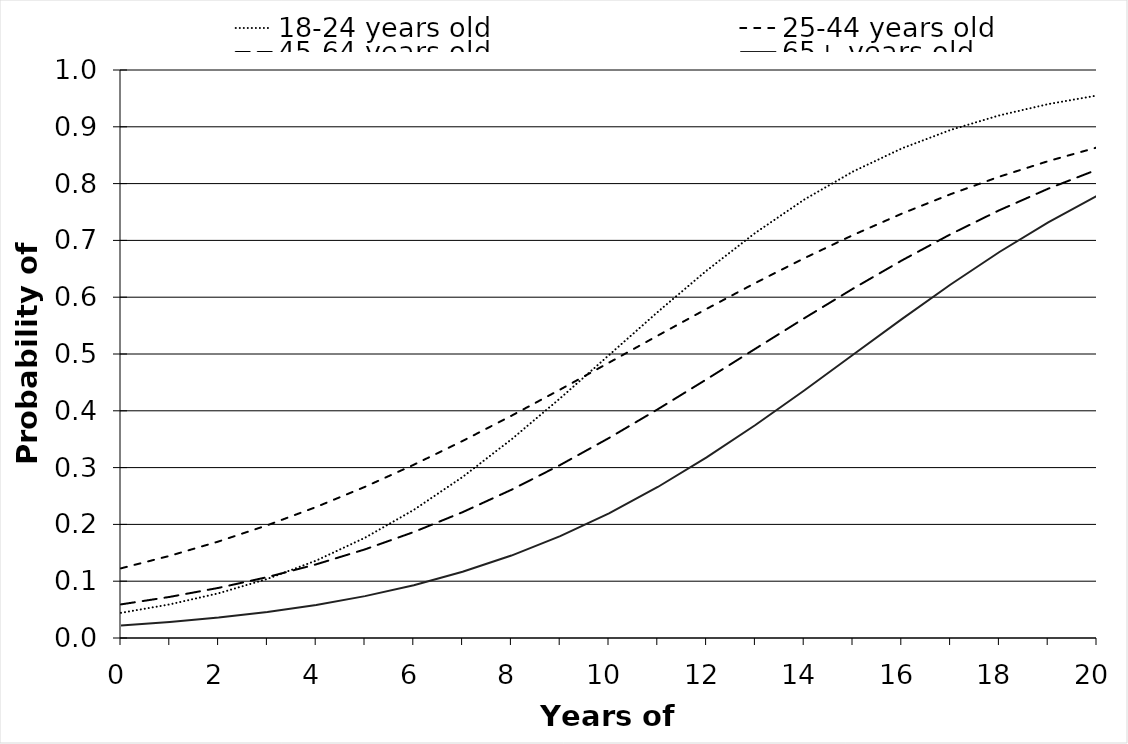
| Category | 18-24 years old | 25-44 years old | 45-64 years old | 65+ years old |
|---|---|---|---|---|
| 0.0 | 0.044 | 0.123 | 0.059 | 0.022 |
| 1.0 | 0.059 | 0.145 | 0.072 | 0.028 |
| 2.0 | 0.079 | 0.17 | 0.088 | 0.036 |
| 3.0 | 0.104 | 0.199 | 0.107 | 0.046 |
| 4.0 | 0.136 | 0.231 | 0.13 | 0.058 |
| 5.0 | 0.177 | 0.266 | 0.156 | 0.074 |
| 6.0 | 0.226 | 0.305 | 0.187 | 0.093 |
| 7.0 | 0.284 | 0.347 | 0.222 | 0.117 |
| 8.0 | 0.35 | 0.391 | 0.261 | 0.145 |
| 9.0 | 0.422 | 0.437 | 0.305 | 0.179 |
| 10.0 | 0.498 | 0.485 | 0.352 | 0.22 |
| 11.0 | 0.574 | 0.532 | 0.403 | 0.266 |
| 12.0 | 0.647 | 0.579 | 0.456 | 0.318 |
| 13.0 | 0.713 | 0.625 | 0.509 | 0.375 |
| 14.0 | 0.772 | 0.669 | 0.563 | 0.436 |
| 15.0 | 0.821 | 0.709 | 0.615 | 0.499 |
| 16.0 | 0.862 | 0.747 | 0.665 | 0.561 |
| 17.0 | 0.895 | 0.781 | 0.711 | 0.622 |
| 18.0 | 0.92 | 0.812 | 0.753 | 0.68 |
| 19.0 | 0.94 | 0.84 | 0.791 | 0.732 |
| 20.0 | 0.955 | 0.864 | 0.824 | 0.778 |